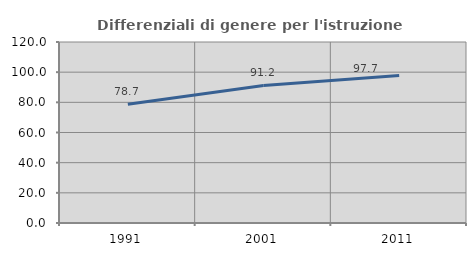
| Category | Differenziali di genere per l'istruzione superiore |
|---|---|
| 1991.0 | 78.667 |
| 2001.0 | 91.212 |
| 2011.0 | 97.745 |